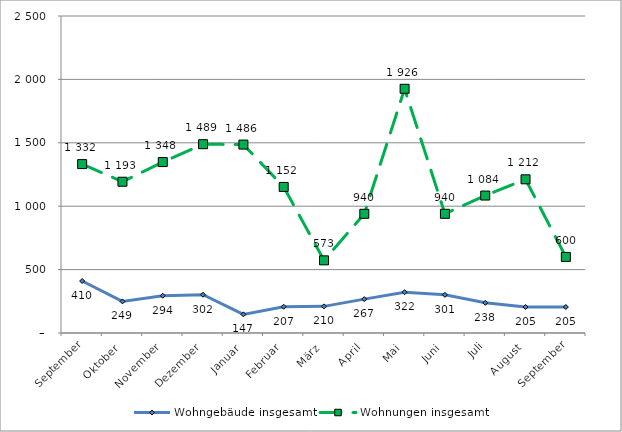
| Category | Wohngebäude insgesamt | Wohnungen insgesamt |
|---|---|---|
| September | 410 | 1332 |
| Oktober | 249 | 1193 |
| November | 294 | 1348 |
| Dezember | 302 | 1489 |
| Januar | 147 | 1486 |
| Februar | 207 | 1152 |
| März | 210 | 573 |
| April | 267 | 940 |
| Mai | 322 | 1926 |
| Juni | 301 | 940 |
| Juli | 238 | 1084 |
| August | 205 | 1212 |
| September | 205 | 600 |